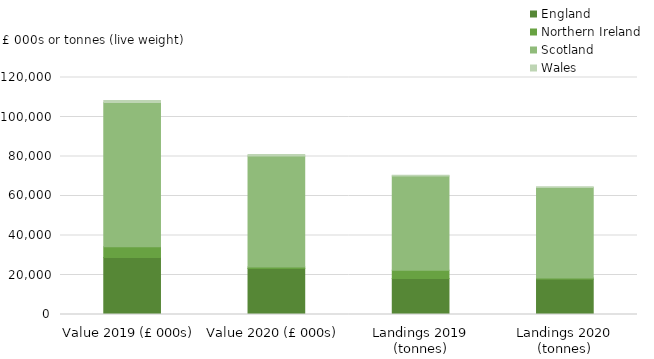
| Category | England | Northern Ireland | Scotland | Wales |
|---|---|---|---|---|
| 0 | 28807.491 | 5478.911 | 73074.918 | 1048.104 |
| 1 | 23230.203 | 879.786 | 56184.864 | 674.314 |
| 2 | 18172.702 | 4239.06 | 47665.046 | 433.418 |
| 3 | 17889.439 | 610.063 | 45819.715 | 307.18 |